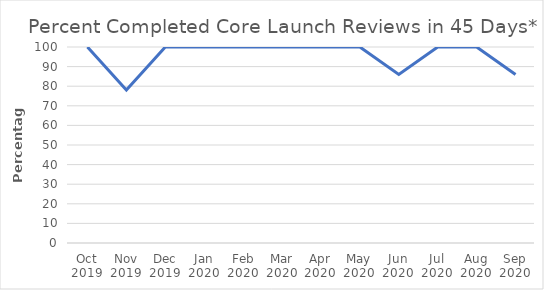
| Category | Percentage |
|---|---|
| Oct 2019 | 100 |
| Nov 2019 | 78 |
| Dec 2019 | 100 |
| Jan 2020 | 100 |
| Feb 2020 | 100 |
| Mar 2020 | 100 |
| Apr 2020 | 100 |
| May 2020 | 100 |
| Jun 2020 | 86 |
| Jul 2020 | 100 |
| Aug 2020 | 100 |
| Sep 2020 | 86 |